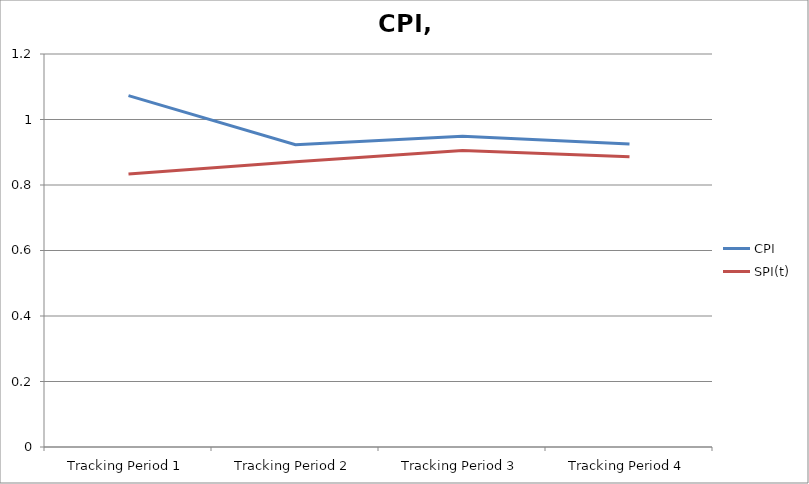
| Category | CPI | SPI(t) |
|---|---|---|
| Tracking Period 1 | 1.073 | 0.833 |
| Tracking Period 2 | 0.923 | 0.871 |
| Tracking Period 3 | 0.949 | 0.905 |
| Tracking Period 4 | 0.925 | 0.886 |